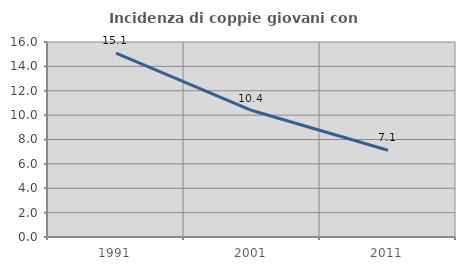
| Category | Incidenza di coppie giovani con figli |
|---|---|
| 1991.0 | 15.091 |
| 2001.0 | 10.379 |
| 2011.0 | 7.12 |